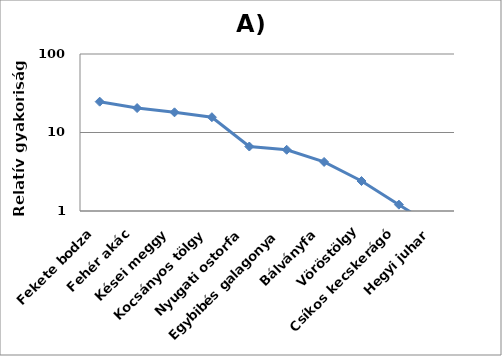
| Category | Series 0 |
|---|---|
| Fekete bodza | 24.699 |
| Fehér akác | 20.482 |
| Kései meggy | 18.072 |
| Kocsányos tölgy | 15.663 |
| Nyugati ostorfa | 6.627 |
| Egybibés galagonya | 6.024 |
| Bálványfa | 4.217 |
| Vöröstölgy | 2.41 |
| Csíkos kecskerágó | 1.205 |
| Hegyi juhar | 0.602 |